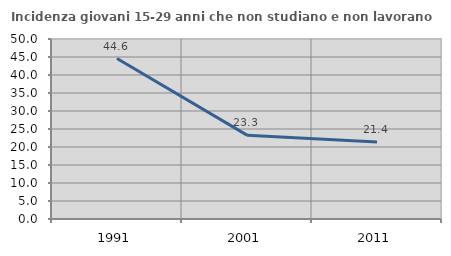
| Category | Incidenza giovani 15-29 anni che non studiano e non lavorano  |
|---|---|
| 1991.0 | 44.569 |
| 2001.0 | 23.297 |
| 2011.0 | 21.421 |